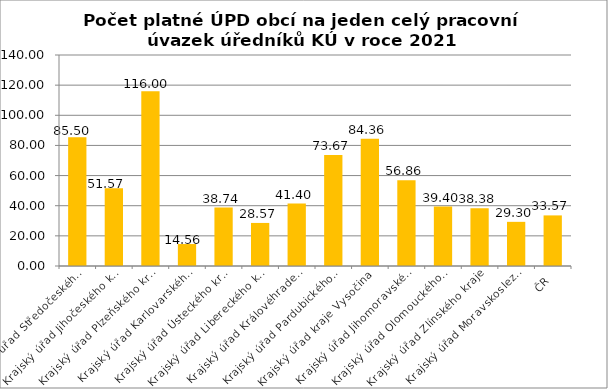
| Category | Počet platné ÚPD obcí na jeden celý pracovní úvazek úředníků KÚ |
|---|---|
| Krajský úřad Středočeského kraje | 85.5 |
| Krajský úřad Jihočeského kraje | 51.57 |
| Krajský úřad Plzeňského kraje | 116 |
| Krajský úřad Karlovarského kraje | 14.56 |
| Krajský úřad Ústeckého kraje | 38.74 |
| Krajský úřad Libereckého kraje | 28.57 |
| Krajský úřad Královéhradeckého kraje | 41.4 |
| Krajský úřad Pardubického kraje | 73.67 |
| Krajský úřad kraje Vysočina | 84.36 |
| Krajský úřad Jihomoravského kraje | 56.86 |
| Krajský úřad Olomouckého kraje | 39.4 |
| Krajský úřad Zlínského kraje | 38.38 |
| Krajský úřad Moravskoslezského kraje | 29.3 |
| ČR | 33.57 |